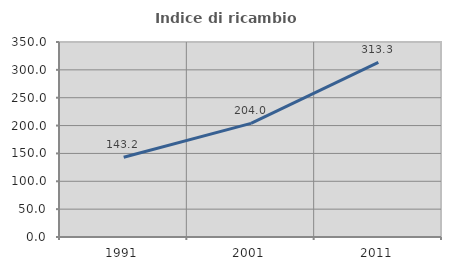
| Category | Indice di ricambio occupazionale  |
|---|---|
| 1991.0 | 143.199 |
| 2001.0 | 203.956 |
| 2011.0 | 313.269 |